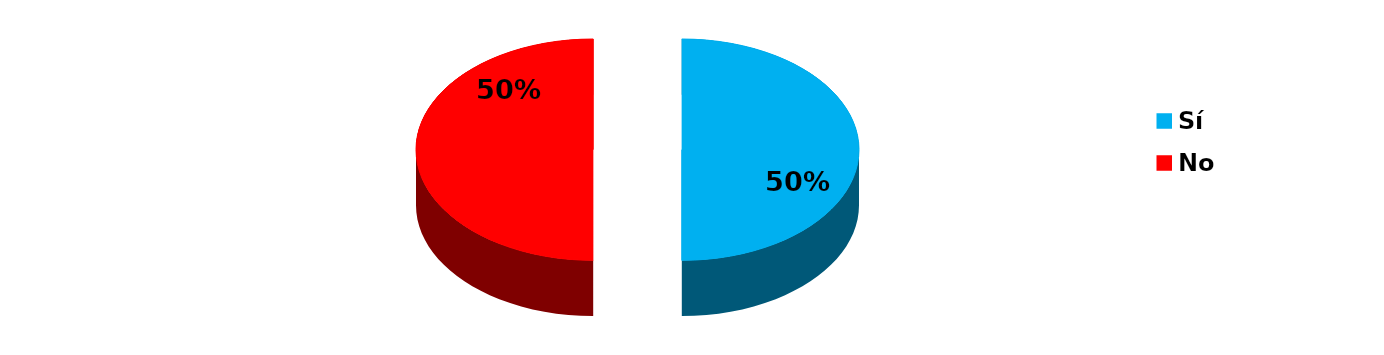
| Category | Series 0 |
|---|---|
| Sí | 10 |
| No | 10 |